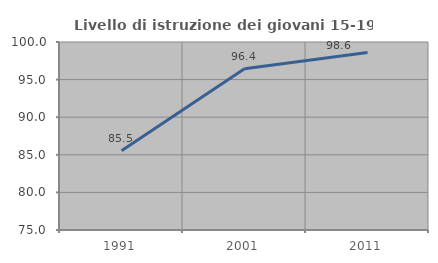
| Category | Livello di istruzione dei giovani 15-19 anni |
|---|---|
| 1991.0 | 85.542 |
| 2001.0 | 96.429 |
| 2011.0 | 98.611 |